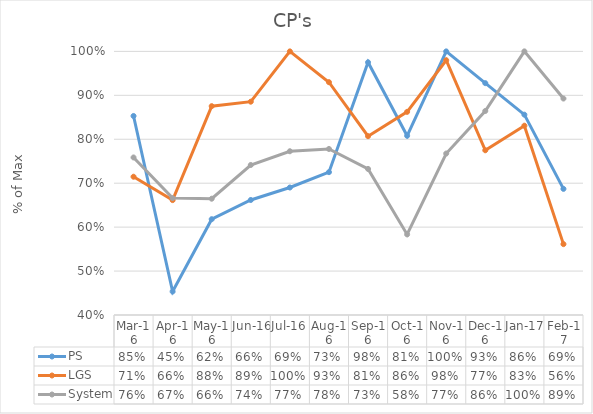
| Category | PS | LGS | System |
|---|---|---|---|
| 2016-03-16 | 0.853 | 0.715 | 0.759 |
| 2016-04-16 | 0.453 | 0.662 | 0.666 |
| 2016-05-16 | 0.618 | 0.875 | 0.665 |
| 2016-06-16 | 0.662 | 0.886 | 0.741 |
| 2016-07-16 | 0.69 | 1 | 0.773 |
| 2016-08-16 | 0.725 | 0.93 | 0.778 |
| 2016-09-16 | 0.975 | 0.807 | 0.732 |
| 2016-10-16 | 0.808 | 0.862 | 0.583 |
| 2016-11-16 | 1 | 0.98 | 0.768 |
| 2016-12-16 | 0.928 | 0.775 | 0.864 |
| 2017-01-16 | 0.856 | 0.831 | 1 |
| 2017-02-16 | 0.687 | 0.561 | 0.893 |